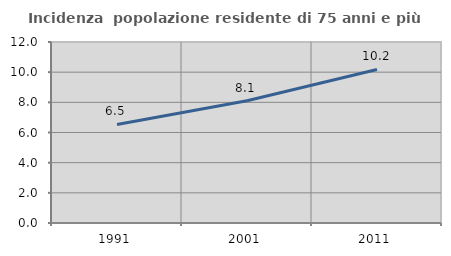
| Category | Incidenza  popolazione residente di 75 anni e più |
|---|---|
| 1991.0 | 6.531 |
| 2001.0 | 8.105 |
| 2011.0 | 10.179 |